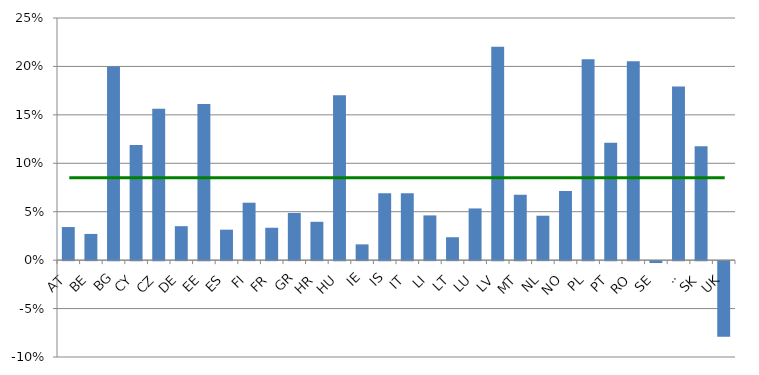
| Category | Series 0 |
|---|---|
| AT | 0.034 |
| BE | 0.027 |
| BG | 0.2 |
| CY | 0.119 |
| CZ | 0.156 |
| DE | 0.035 |
| EE | 0.161 |
| ES | 0.031 |
| FI | 0.059 |
| FR | 0.033 |
| GR | 0.049 |
| HR | 0.04 |
| HU | 0.17 |
| IE | 0.016 |
| IS | 0.069 |
| IT | 0.069 |
| LI | 0.046 |
| LT | 0.024 |
| LU | 0.053 |
| LV | 0.22 |
| MT | 0.067 |
| NL | 0.046 |
| NO | 0.071 |
| PL | 0.207 |
| PT | 0.121 |
| RO | 0.205 |
| SE | -0.002 |
| SI | 0.179 |
| SK | 0.117 |
| UK | -0.078 |